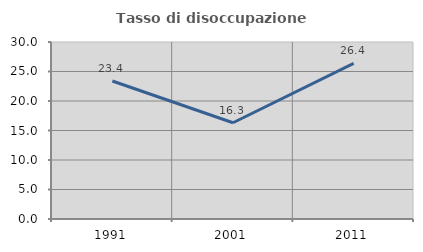
| Category | Tasso di disoccupazione giovanile  |
|---|---|
| 1991.0 | 23.39 |
| 2001.0 | 16.311 |
| 2011.0 | 26.392 |